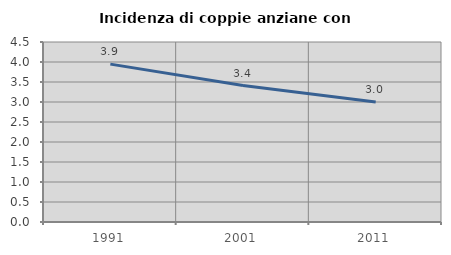
| Category | Incidenza di coppie anziane con figli |
|---|---|
| 1991.0 | 3.947 |
| 2001.0 | 3.412 |
| 2011.0 | 2.997 |